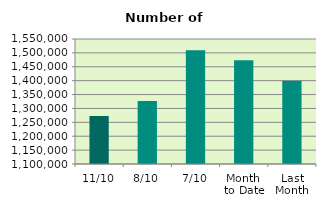
| Category | Series 0 |
|---|---|
| 11/10 | 1272782 |
| 8/10 | 1327220 |
| 7/10 | 1509330 |
| Month 
to Date | 1473480 |
| Last
Month | 1399299.909 |